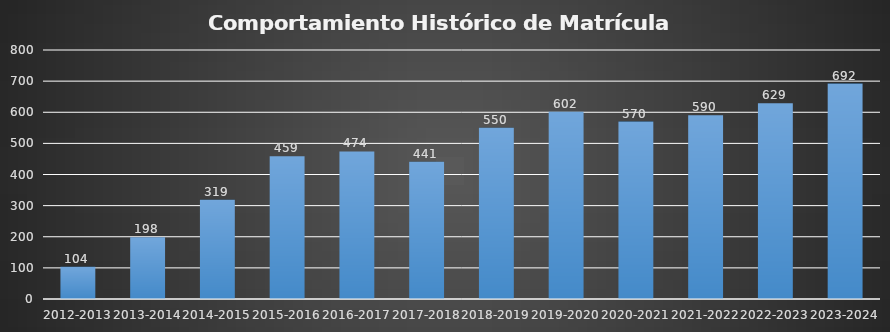
| Category | Series 0 |
|---|---|
| 2012-2013 | 104 |
| 2013-2014 | 198 |
| 2014-2015 | 319 |
| 2015-2016 | 459 |
| 2016-2017 | 474 |
| 2017-2018 | 441 |
| 2018-2019 | 550 |
| 2019-2020 | 602 |
| 2020-2021 | 570 |
| 2021-2022 | 590 |
| 2022-2023 | 629 |
| 2023-2024 | 692 |